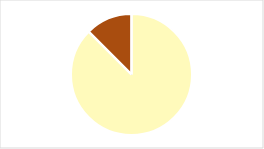
| Category | Series 0 |
|---|---|
| 0 | 0 |
| 1 | 0.875 |
| 2 | 0 |
| 3 | 0 |
| 4 | 0.125 |